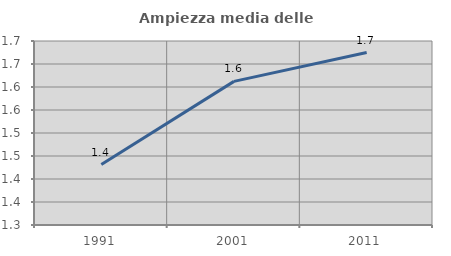
| Category | Ampiezza media delle famiglie |
|---|---|
| 1991.0 | 1.431 |
| 2001.0 | 1.612 |
| 2011.0 | 1.675 |